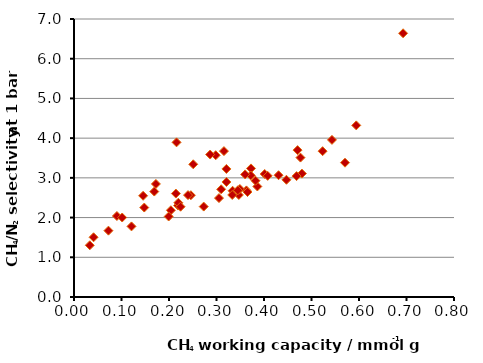
| Category | Series 0 |
|---|---|
| 0.25108069033414837 | 3.342 |
| 0.34698711611927313 | 2.57 |
| 0.29842050602061876 | 3.569 |
| 0.04115849075067214 | 1.504 |
| 0.09039275430139211 | 2.039 |
| 0.14793800552222613 | 2.253 |
| 0.16904527785643936 | 2.655 |
| 0.3156417528694474 | 3.674 |
| 0.2460515981864342 | 2.563 |
| 0.21912535149757528 | 2.303 |
| 0.36295839588296763 | 2.684 |
| 0.44727737159238884 | 2.951 |
| 0.385995460345263 | 2.783 |
| 0.27308577960260527 | 2.277 |
| 0.03319716601410952 | 1.303 |
| 0.5705460603570714 | 3.382 |
| 0.2865473421917829 | 3.587 |
| 0.2196573760642549 | 2.374 |
| 0.47674428136286356 | 3.51 |
| 0.6928265333878072 | 6.64 |
| 0.4798245585262304 | 3.107 |
| 0.40147105532758876 | 3.098 |
| 0.22433694296332427 | 2.273 |
| 0.36526572797569523 | 2.644 |
| 0.21592068445184043 | 3.894 |
| 0.3821226402888527 | 2.928 |
| 0.32098445698534994 | 2.896 |
| 0.12104134617382112 | 1.778 |
| 0.30985319035935655 | 2.712 |
| 0.33385622413050997 | 2.675 |
| 0.10141982909052741 | 2.001 |
| 0.4706815453097463 | 3.699 |
| 0.5942230088305688 | 4.321 |
| 0.3052533851288039 | 2.491 |
| 0.4685772671881049 | 3.044 |
| 0.20396544294434657 | 2.184 |
| 0.214503071742836 | 2.604 |
| 0.17243770275101764 | 2.847 |
| 0.5233798181213352 | 3.672 |
| 0.37263448945831384 | 3.237 |
| 0.3208799577912213 | 3.224 |
| 0.43061048693591886 | 3.067 |
| 0.14549518433873782 | 2.549 |
| 0.19934900171408518 | 2.027 |
| 0.3492361182863241 | 2.72 |
| 0.3721293339652988 | 3.06 |
| 0.333149803913958 | 2.568 |
| 0.24007575026076772 | 2.566 |
| 0.3450121958878999 | 2.687 |
| 0.3603053193202107 | 3.087 |
| 0.4077666327358818 | 3.05 |
| 0.07247029477020063 | 1.67 |
| 0.543036062466584 | 3.956 |